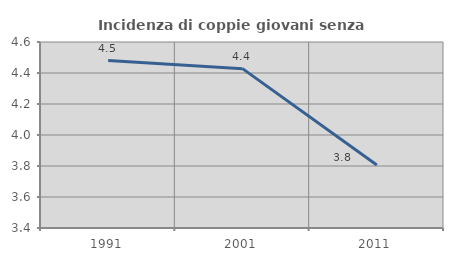
| Category | Incidenza di coppie giovani senza figli |
|---|---|
| 1991.0 | 4.48 |
| 2001.0 | 4.428 |
| 2011.0 | 3.807 |